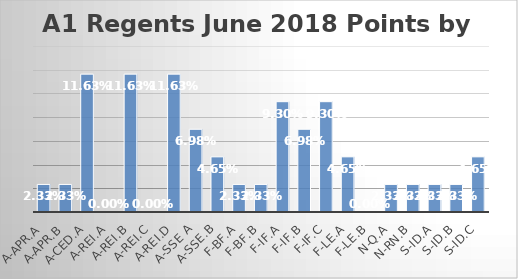
| Category | Series 0 |
|---|---|
| A-APR.A | 0.023 |
| A-APR.B | 0.023 |
| A-CED.A | 0.116 |
| A-REI.A | 0 |
| A-REI.B | 0.116 |
| A-REI.C | 0 |
| A-REI.D | 0.116 |
| A-SSE A | 0.07 |
| A-SSE.B | 0.047 |
| F-BF.A | 0.023 |
| F-BF.B | 0.023 |
| F-IF.A | 0.093 |
| F-IF.B | 0.07 |
| F-IF.C | 0.093 |
| F-LE.A | 0.047 |
| F-LE.B | 0 |
| N-Q.A | 0.023 |
| N-RN.B | 0.023 |
| S-ID.A | 0.023 |
| S-ID.B | 0.023 |
| S-ID.C | 0.047 |